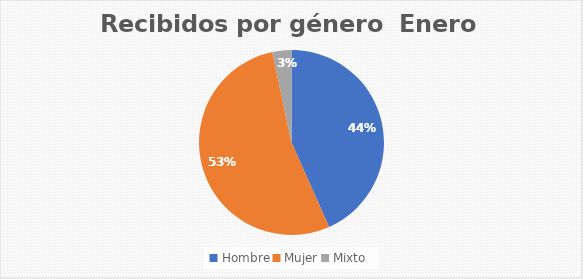
| Category | Recibidos por género  Enero |
|---|---|
| Hombre | 13 |
| Mujer | 16 |
| Mixto | 1 |